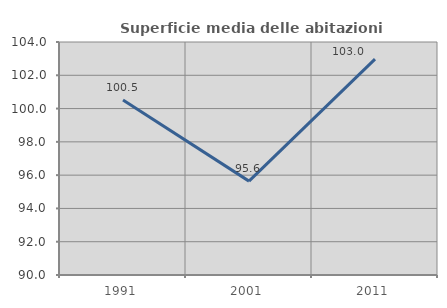
| Category | Superficie media delle abitazioni occupate |
|---|---|
| 1991.0 | 100.518 |
| 2001.0 | 95.64 |
| 2011.0 | 102.973 |